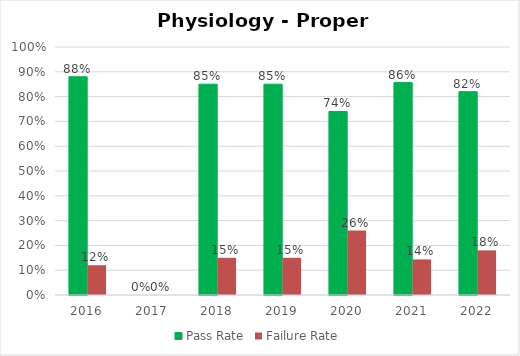
| Category | Pass Rate | Failure Rate |
|---|---|---|
| 2016.0 | 0.88 | 0.12 |
| 2017.0 | 0 | 0 |
| 2018.0 | 0.85 | 0.15 |
| 2019.0 | 0.85 | 0.15 |
| 2020.0 | 0.74 | 0.26 |
| 2021.0 | 0.856 | 0.144 |
| 2022.0 | 0.82 | 0.18 |